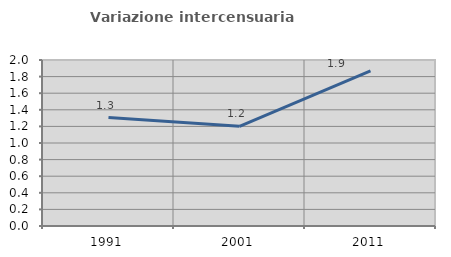
| Category | Variazione intercensuaria annua |
|---|---|
| 1991.0 | 1.307 |
| 2001.0 | 1.201 |
| 2011.0 | 1.869 |